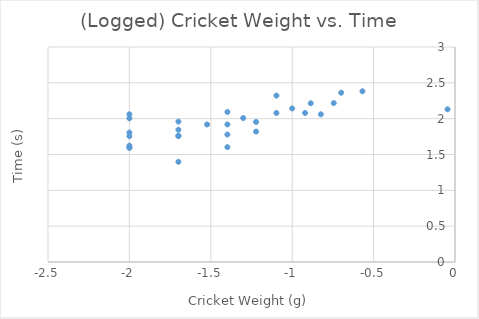
| Category | Time (s) |
|---|---|
| -0.823908740944319 | 2.061 |
| -0.698970004336019 | 2.362 |
| -1.096910013008056 | 2.079 |
| -1.221848749616356 | 1.954 |
| -1.221848749616356 | 1.82 |
| -2.0 | 1.806 |
| -0.920818753952375 | 2.079 |
| -0.0457574905606751 | 2.13 |
| -1.397940008672037 | 1.778 |
| -0.568636235841013 | 2.382 |
| -0.744727494896694 | 2.217 |
| -0.886056647693163 | 2.215 |
| -1.0 | 2.143 |
| -1.096910013008056 | 2.322 |
| -1.301029995663981 | 2.009 |
| -1.698970004336019 | 1.763 |
| -1.397940008672037 | 1.602 |
| -2.0 | 1.591 |
| -2.0 | 2.061 |
| -2.0 | 1.623 |
| -1.698970004336019 | 1.398 |
| -1.698970004336019 | 1.845 |
| -2.0 | 1.602 |
| -1.698970004336019 | 1.756 |
| -1.397940008672037 | 2.093 |
| -1.698970004336019 | 1.959 |
| -2.0 | 2.004 |
| -1.397940008672037 | 1.919 |
| -1.522878745280338 | 1.919 |
| -2.0 | 1.756 |